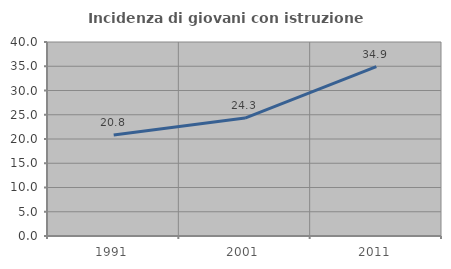
| Category | Incidenza di giovani con istruzione universitaria |
|---|---|
| 1991.0 | 20.827 |
| 2001.0 | 24.318 |
| 2011.0 | 34.918 |